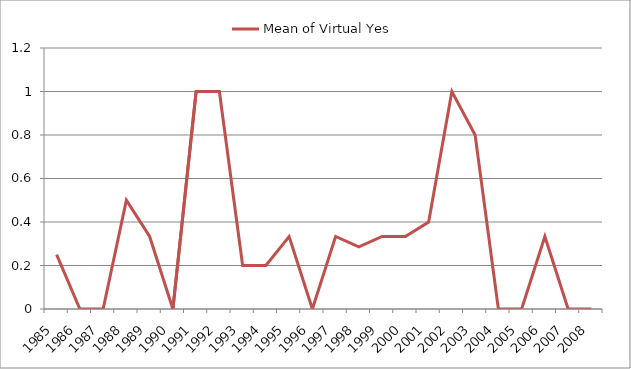
| Category | Mean of Virtual Yes |
|---|---|
| 1985.0 | 0.25 |
| 1986.0 | 0 |
| 1987.0 | 0 |
| 1988.0 | 0.5 |
| 1989.0 | 0.333 |
| 1990.0 | 0 |
| 1991.0 | 1 |
| 1992.0 | 1 |
| 1993.0 | 0.2 |
| 1994.0 | 0.2 |
| 1995.0 | 0.333 |
| 1996.0 | 0 |
| 1997.0 | 0.333 |
| 1998.0 | 0.286 |
| 1999.0 | 0.333 |
| 2000.0 | 0.333 |
| 2001.0 | 0.4 |
| 2002.0 | 1 |
| 2003.0 | 0.8 |
| 2004.0 | 0 |
| 2005.0 | 0 |
| 2006.0 | 0.333 |
| 2007.0 | 0 |
| 2008.0 | 0 |